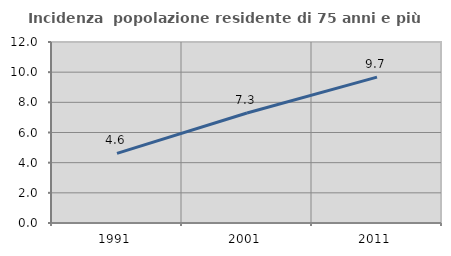
| Category | Incidenza  popolazione residente di 75 anni e più |
|---|---|
| 1991.0 | 4.615 |
| 2001.0 | 7.295 |
| 2011.0 | 9.67 |